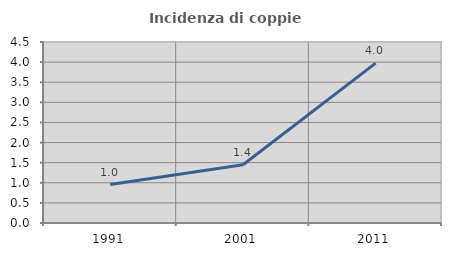
| Category | Incidenza di coppie miste |
|---|---|
| 1991.0 | 0.957 |
| 2001.0 | 1.448 |
| 2011.0 | 3.975 |